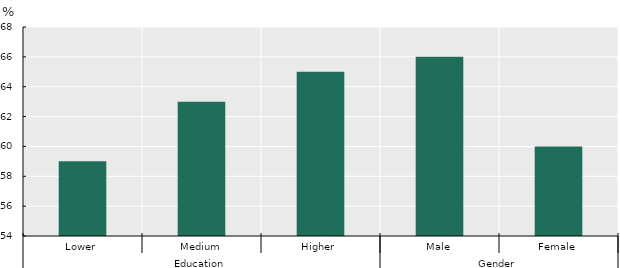
| Category | Series 0 |
|---|---|
| 0 | 59 |
| 1 | 63 |
| 2 | 65 |
| 3 | 66 |
| 4 | 60 |